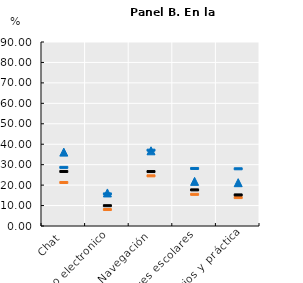
| Category | Series 0 | Series 2 | Series 1 | Series 3 |
|---|---|---|---|---|
| Chat | 21.284 | 26.666 | 28.668 | 36.141 |
| Correo electronico | 8.057 | 9.933 | 15.712 | 16.175 |
| Navegación | 24.537 | 26.631 | 37.088 | 36.787 |
| Deberes escolares | 15.483 | 17.664 | 28.138 | 21.832 |
| Ejercicios y práctica | 13.892 | 15.208 | 27.98 | 21.188 |